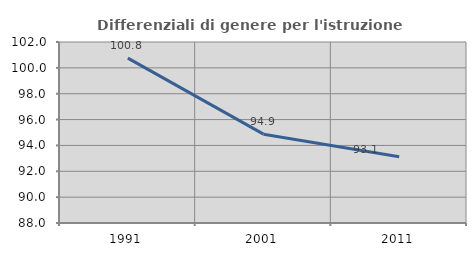
| Category | Differenziali di genere per l'istruzione superiore |
|---|---|
| 1991.0 | 100.75 |
| 2001.0 | 94.871 |
| 2011.0 | 93.13 |